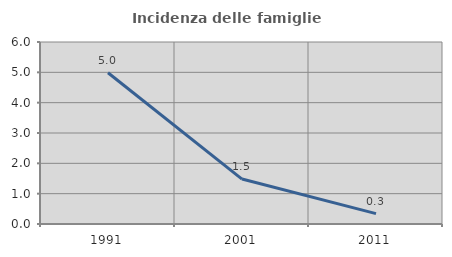
| Category | Incidenza delle famiglie numerose |
|---|---|
| 1991.0 | 4.988 |
| 2001.0 | 1.481 |
| 2011.0 | 0.341 |